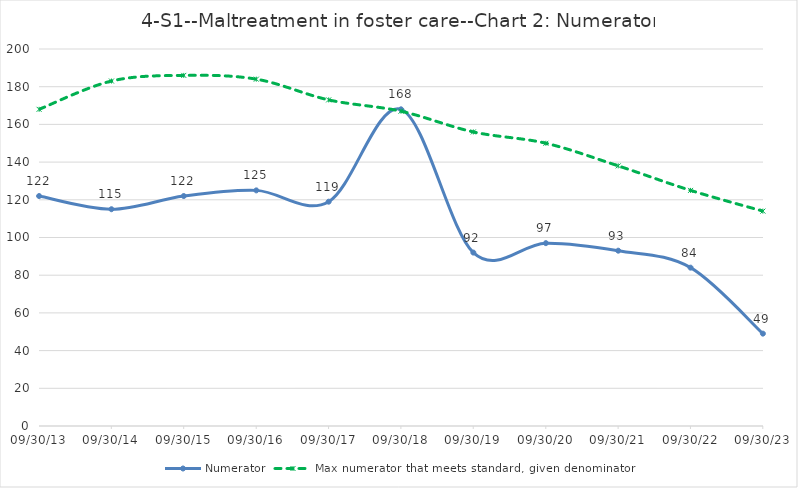
| Category | Numerator | Max numerator that meets standard, given denominator |
|---|---|---|
| 2013-09-30 | 122 | 168 |
| 2014-09-30 | 115 | 183 |
| 2015-09-30 | 122 | 186 |
| 2016-09-30 | 125 | 184 |
| 2017-09-30 | 119 | 173 |
| 2018-09-30 | 168 | 167 |
| 2019-09-30 | 92 | 156 |
| 2020-09-30 | 97 | 150 |
| 2021-09-30 | 93 | 138 |
| 2022-09-30 | 84 | 125 |
| 2023-09-30 | 49 | 114 |